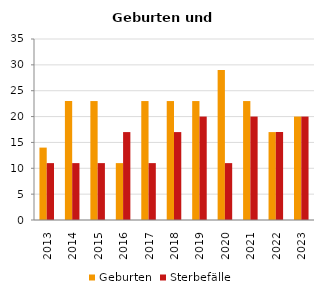
| Category | Geburten | Sterbefälle |
|---|---|---|
| 2013.0 | 14 | 11 |
| 2014.0 | 23 | 11 |
| 2015.0 | 23 | 11 |
| 2016.0 | 11 | 17 |
| 2017.0 | 23 | 11 |
| 2018.0 | 23 | 17 |
| 2019.0 | 23 | 20 |
| 2020.0 | 29 | 11 |
| 2021.0 | 23 | 20 |
| 2022.0 | 17 | 17 |
| 2023.0 | 20 | 20 |